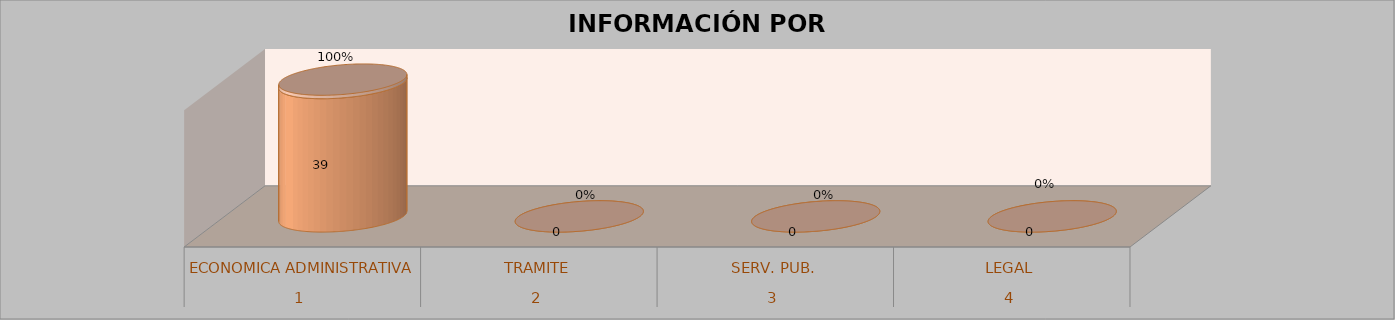
| Category | Series 0 | Series 1 | Series 2 | Series 3 |
|---|---|---|---|---|
| 0 |  |  | 39 | 1 |
| 1 |  |  | 0 | 0 |
| 2 |  |  | 0 | 0 |
| 3 |  |  | 0 | 0 |